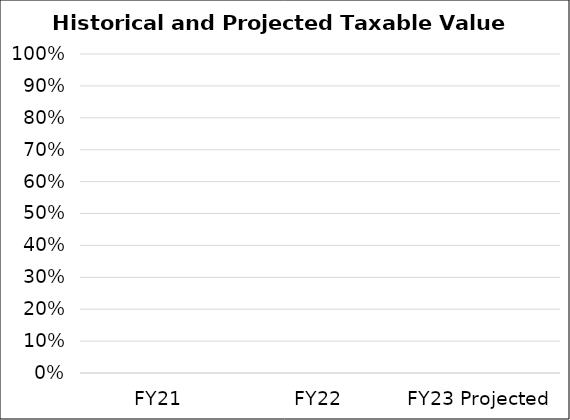
| Category | Series 0 |
|---|---|
| FY21 | 0 |
| FY22 | 0 |
| FY23 Projected | 0 |